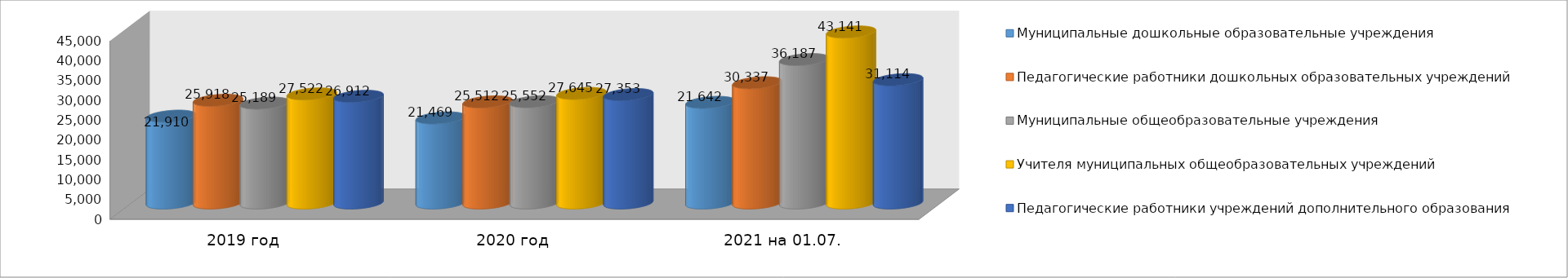
| Category | Муниципальные дошкольные образовательные учреждения | Педагогические работники дошкольных образовательных учреждений | Муниципальные общеобразовательные учреждения | Учителя муниципальных общеобразовательных учреждений | Педагогические работники учреждений дополнительного образования |
|---|---|---|---|---|---|
| 2019 год | 21910 | 25918 | 25189 | 27522 | 26912 |
| 2020 год | 21469 | 25512 | 25552 | 27645 | 27353 |
| 2021 на 01.07. | 25390 | 30337 | 36187 | 43141 | 31114 |